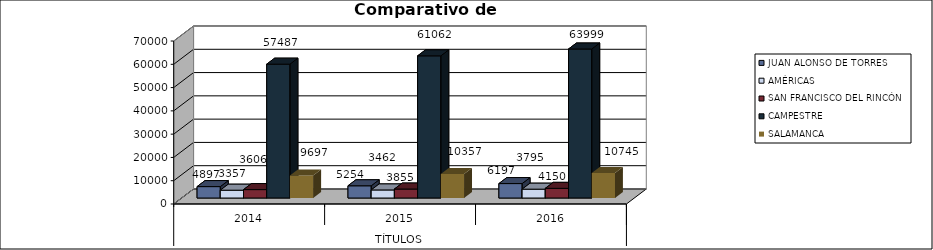
| Category | JUAN ALONSO DE TORRES | AMÉRICAS | SAN FRANCISCO DEL RINCÓN | CAMPESTRE | SALAMANCA |
|---|---|---|---|---|---|
| 0 | 4897 | 3357 | 3606 | 57487 | 9697 |
| 1 | 5254 | 3462 | 3855 | 61062 | 10357 |
| 2 | 6197 | 3795 | 4150 | 63999 | 10745 |